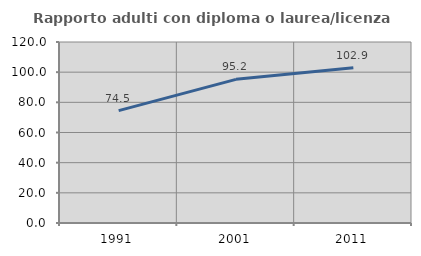
| Category | Rapporto adulti con diploma o laurea/licenza media  |
|---|---|
| 1991.0 | 74.518 |
| 2001.0 | 95.233 |
| 2011.0 | 102.882 |